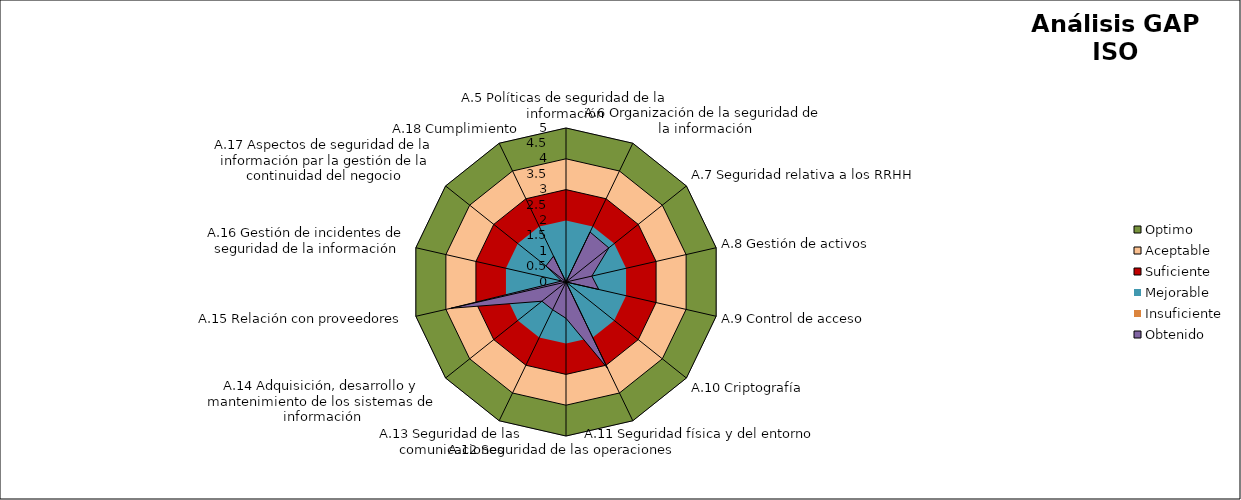
| Category | Optimo | Aceptable | Suficiente | Mejorable | Insuficiente | Obtenido |
|---|---|---|---|---|---|---|
| A.5 Políticas de seguridad de la información | 5 | 4 | 3 | 2 |  | 0 |
| A.6 Organización de la seguridad de la información | 5 | 4 | 3 | 2 |  | 1.8 |
| A.7 Seguridad relativa a los RRHH | 5 | 4 | 3 | 2 |  | 1.778 |
| A.8 Gestión de activos | 5 | 4 | 3 | 2 |  | 0.861 |
| A.9 Control de acceso | 5 | 4 | 3 | 2 |  | 1.092 |
| A.10 Criptografía | 5 | 4 | 3 | 2 |  | 0 |
| A.11 Seguridad física y del entorno | 5 | 4 | 3 | 2 |  | 3.111 |
| A.12 Seguridad de las operaciones | 5 | 4 | 3 | 2 |  | 1.179 |
| A.13 Seguridad de las comunicaciones | 5 | 4 | 3 | 2 |  | 1 |
| A.14 Adquisición, desarrollo y mantenimiento de los sistemas de información | 5 | 4 | 3 | 2 |  | 1 |
| A.15 Relación con proveedores | 5 | 4 | 3 | 2 |  | 3.833 |
| A.16 Gestión de incidentes de seguridad de la información | 5 | 4 | 3 | 2 |  | 0.143 |
| A.17 Aspectos de seguridad de la información par la gestión de la continuidad del negocio | 5 | 4 | 3 | 2 |  | 0.833 |
| A.18 Cumplimiento | 5 | 4 | 3 | 2 |  | 0.933 |